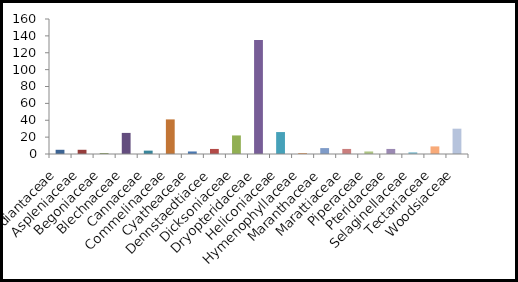
| Category | total |
|---|---|
| Adiantaceae | 5 |
| Aspleniaceae | 5 |
| Begoniaceae | 1 |
| Blechnaceae | 25 |
| Cannaceae | 4 |
| Commelinaceae | 41 |
| Cyatheaceae | 3 |
| Dennstaedtiacee | 6 |
| Dicksoniaceae | 22 |
| Dryopteridaceae | 135 |
| Heliconiaceae | 26 |
| Hymenophyllaceae | 1 |
| Maranthaceae | 7 |
| Marattiaceae | 6 |
| Piperaceae | 3 |
| Pteridaceae | 6 |
| Selaginellaceae | 2 |
| Tectariaceae | 9 |
| Woodsiaceae | 30 |